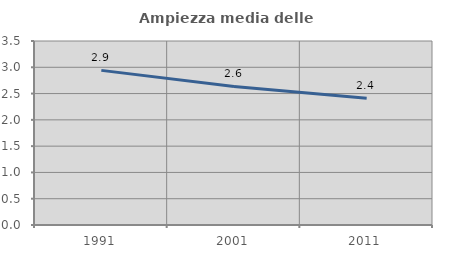
| Category | Ampiezza media delle famiglie |
|---|---|
| 1991.0 | 2.941 |
| 2001.0 | 2.635 |
| 2011.0 | 2.409 |